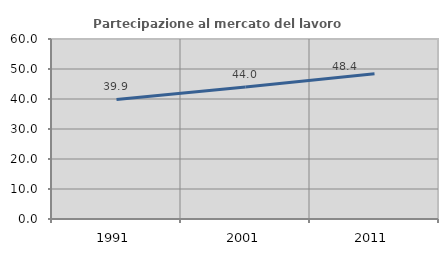
| Category | Partecipazione al mercato del lavoro  femminile |
|---|---|
| 1991.0 | 39.858 |
| 2001.0 | 44.024 |
| 2011.0 | 48.421 |